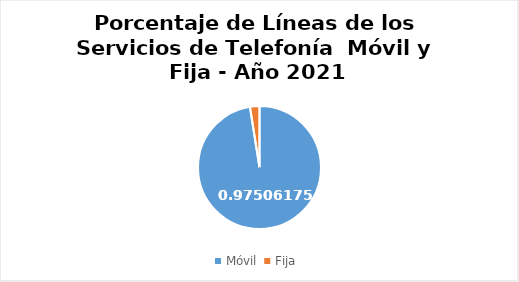
| Category | Series 0 |
|---|---|
| Móvil  | 0.975 |
| Fija  | 0.025 |